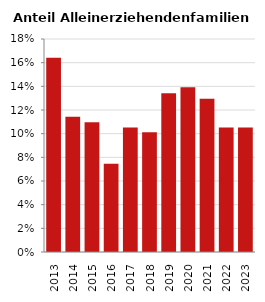
| Category | Anteil Alleinerziehende an Familien |
|---|---|
| 2013.0 | 0.164 |
| 2014.0 | 0.114 |
| 2015.0 | 0.11 |
| 2016.0 | 0.075 |
| 2017.0 | 0.105 |
| 2018.0 | 0.101 |
| 2019.0 | 0.134 |
| 2020.0 | 0.139 |
| 2021.0 | 0.129 |
| 2022.0 | 0.105 |
| 2023.0 | 0.105 |